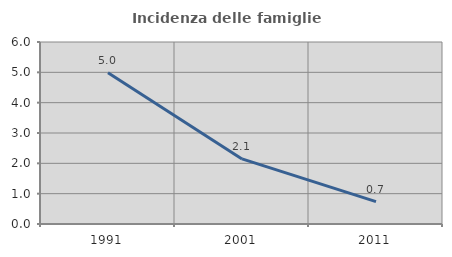
| Category | Incidenza delle famiglie numerose |
|---|---|
| 1991.0 | 4.985 |
| 2001.0 | 2.145 |
| 2011.0 | 0.736 |